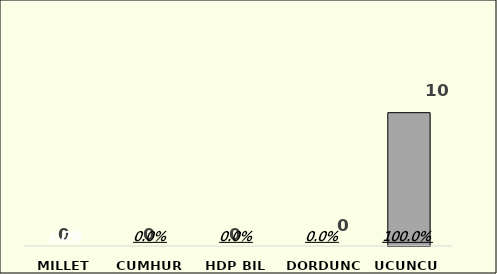
| Category | MV SAYI |
|---|---|
| MILLET | 0 |
| CUMHUR | 0 |
| HDP BIL | 0 |
| DORDUNCU | 0 |
| UCUNCU | 10 |